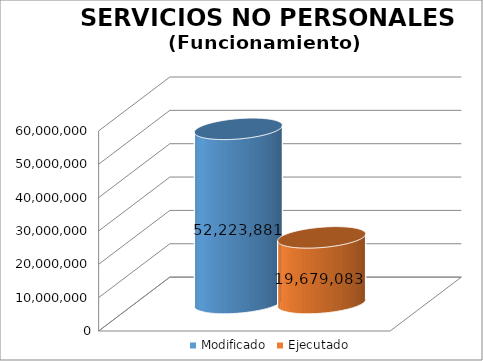
| Category | Modificado | Ejecutado |
|---|---|---|
| 0 | 52223881 | 19679082.51 |